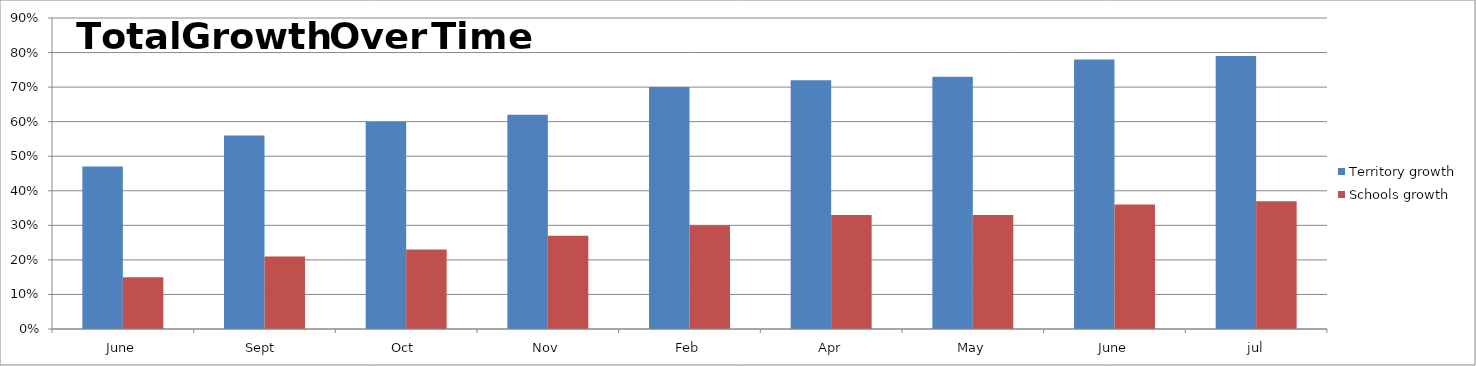
| Category | Territory growth | Schools growth |
|---|---|---|
| June | 0.47 | 0.15 |
| Sept  | 0.56 | 0.21 |
| Oct  | 0.6 | 0.23 |
| Nov | 0.62 | 0.27 |
| Feb | 0.7 | 0.3 |
| Apr | 0.72 | 0.33 |
| May | 0.73 | 0.33 |
| June | 0.78 | 0.36 |
| jul | 0.79 | 0.37 |